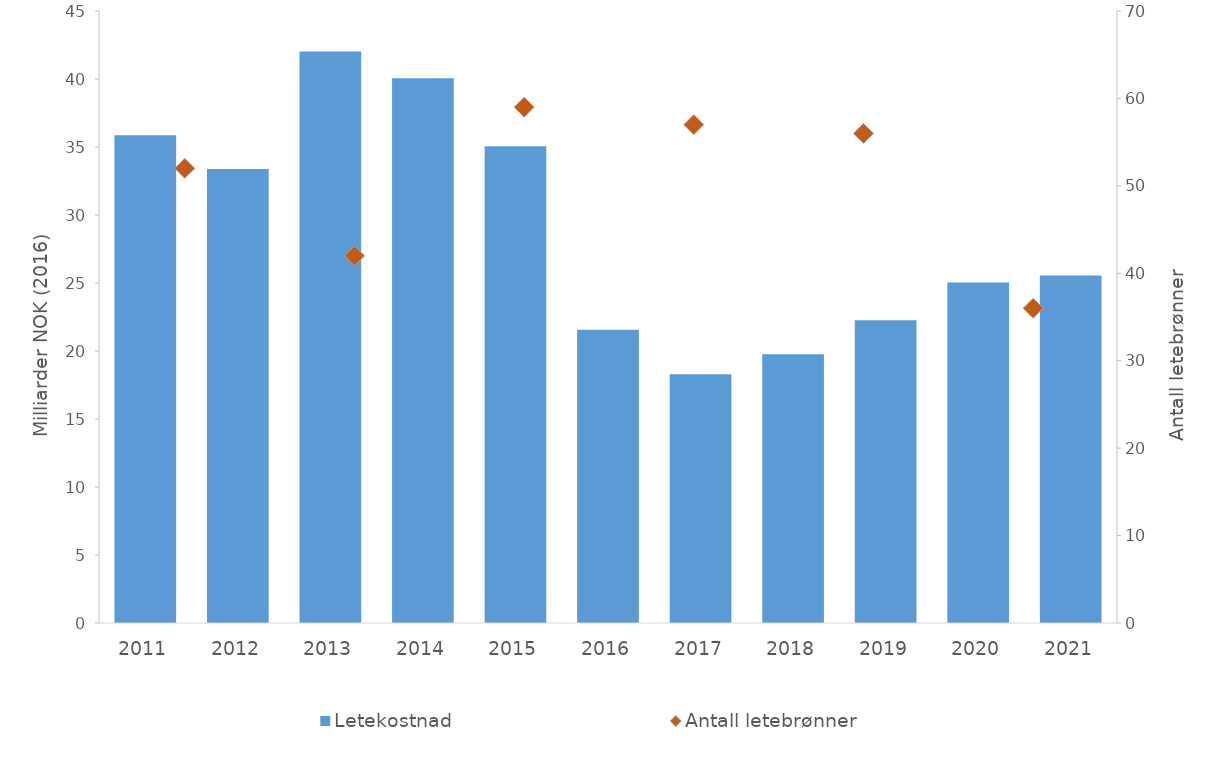
| Category | Letekostnad  |
|---|---|
| 2011.0 | 35.87 |
| 2012.0 | 33.381 |
| 2013.0 | 42.013 |
| 2014.0 | 40.06 |
| 2015.0 | 35.049 |
| 2016.0 | 21.555 |
| 2017.0 | 18.285 |
| 2018.0 | 19.754 |
| 2019.0 | 22.259 |
| 2020.0 | 25.042 |
| 2021.0 | 25.554 |